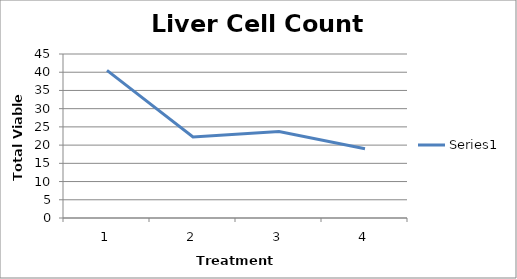
| Category | Series 0 |
|---|---|
| 0 | 40.5 |
| 1 | 22.25 |
| 2 | 23.75 |
| 3 | 19 |